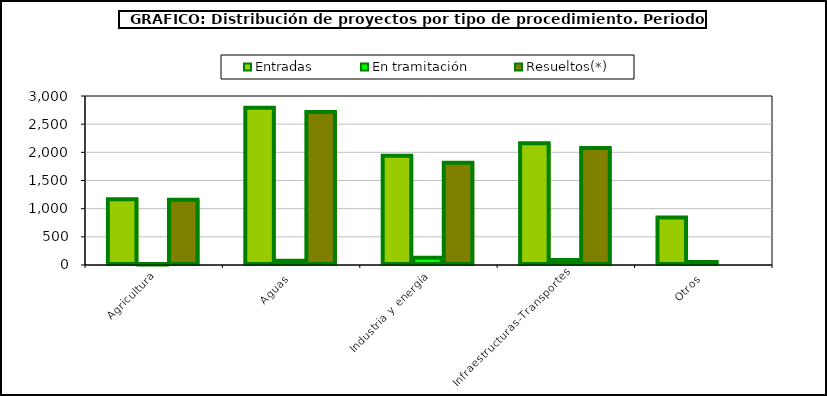
| Category | Entradas | En tramitación | Resueltos(*) |
|---|---|---|---|
| Agricultura | 1165 | 10 | 1157 |
| Aguas | 2791 | 77 | 2718 |
| Industria y energía | 1940 | 128 | 1813 |
| Infraestructuras-Transportes | 2161 | 89 | 2078 |
| Otros | 841 | 52 | 0 |